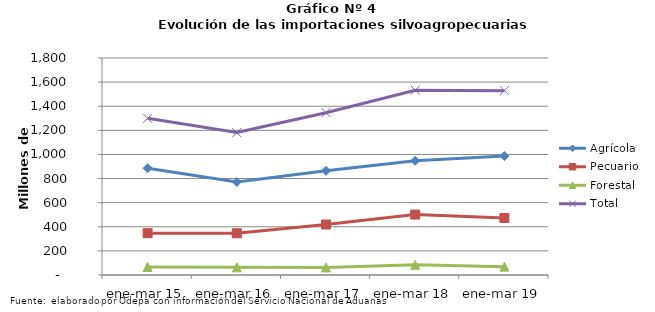
| Category | Agrícola | Pecuario | Forestal | Total |
|---|---|---|---|---|
| ene-mar 15 | 885430 | 346935 | 67134 | 1299499 |
| ene-mar 16 | 771462 | 346118 | 63907 | 1181487 |
| ene-mar 17 | 864541 | 418756 | 63155 | 1346452 |
| ene-mar 18 | 947357 | 501434 | 84236 | 1533027 |
| ene-mar 19 | 986506 | 473093 | 69109 | 1528708 |